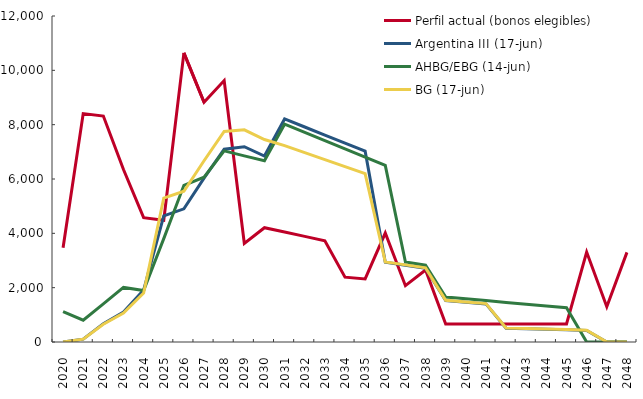
| Category | Perfil actual (bonos elegibles) | Argentina III (17-jun) | AHBG/EBG (14-jun) | BG (17-jun) |
|---|---|---|---|---|
| 2020  | 3468.006 | 0 | 1118.586 | 0 |
| 2021  | 8408.217 | 103.695 | 803.976 | 104.735 |
| 2022  | 8316.957 | 676.156 | 1402.893 | 655.769 |
| 2023  | 6349.533 | 1102.733 | 2008.496 | 1068.582 |
| 2024  | 4578.679 | 1909.189 | 1891.874 | 1805.269 |
| 2025  | 4482.02 | 4645.332 | 3806.508 | 5298.664 |
| 2026  | 10641.048 | 4903.136 | 5768.703 | 5549.982 |
| 2027  | 8826.965 | 6031.573 | 6068.284 | 6672.629 |
| 2028  | 9625.131 | 7094.784 | 7034.564 | 7749.671 |
| 2029  | 3627.177 | 7188.8 | 6851.864 | 7808.157 |
| 2030  | 4206.733 | 6845.507 | 6669.164 | 7451.865 |
| 2031  | 4047.049 | 8211.385 | 8017.275 | 7229.775 |
| 2032  | 3887.51 | 7914.403 | 7715.681 | 6972.18 |
| 2033  | 3727.682 | 7617.421 | 7414.087 | 6714.585 |
| 2034  | 2386.228 | 7320.439 | 7111.668 | 6456.99 |
| 2035  | 2323.413 | 7023.457 | 6806.776 | 6199.394 |
| 2036  | 4010.742 | 2935.934 | 6501.884 | 2948.922 |
| 2037  | 2073.095 | 2825.909 | 2945.65 | 2838.478 |
| 2038  | 2651.723 | 2715.883 | 2826.064 | 2728.034 |
| 2039  | 664.579 | 1522.102 | 1654.449 | 1533.835 |
| 2040  | 664.723 | 1462.466 | 1589.019 | 1473.781 |
| 2041  | 664.579 | 1402.83 | 1523.589 | 1413.727 |
| 2042  | 664.579 | 508.247 | 1458.159 | 518.726 |
| 2043  | 664.579 | 487.974 | 1392.729 | 498.036 |
| 2044  | 664.723 | 467.702 | 1327.299 | 477.345 |
| 2045  | 664.579 | 447.43 | 1261.869 | 456.655 |
| 2046  | 3309.735 | 427.157 | 0 | 435.965 |
| 2047  | 1298.157 | 0 | 0 | 0 |
| 2048  | 3299.062 | 0 | 0 | 0 |